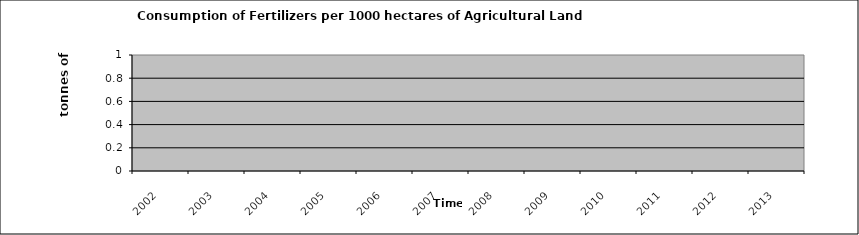
| Category | Series 0 |
|---|---|
| 2002.0 | 0 |
| 2003.0 | 0 |
| 2004.0 | 0 |
| 2005.0 | 0 |
| 2006.0 | 0 |
| 2007.0 | 0 |
| 2008.0 | 0 |
| 2009.0 | 0 |
| 2010.0 | 0 |
| 2011.0 | 0 |
| 2012.0 | 0 |
| 2013.0 | 0 |